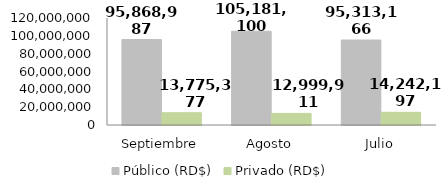
| Category | Público (RD$) | Privado (RD$) |
|---|---|---|
| Septiembre | 95868987 | 13775377 |
| Agosto | 105181100 | 12999911.3 |
| Julio | 95313166.1 | 14242197 |